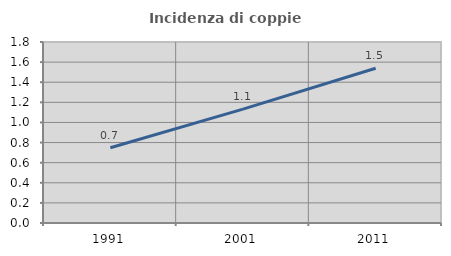
| Category | Incidenza di coppie miste |
|---|---|
| 1991.0 | 0.748 |
| 2001.0 | 1.133 |
| 2011.0 | 1.539 |